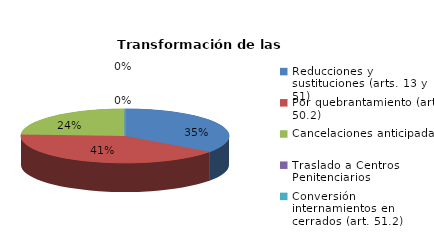
| Category | Series 0 |
|---|---|
| Reducciones y sustituciones (arts. 13 y 51) | 58 |
| Por quebrantamiento (art. 50.2) | 68 |
| Cancelaciones anticipadas | 40 |
| Traslado a Centros Penitenciarios | 0 |
| Conversión internamientos en cerrados (art. 51.2) | 0 |